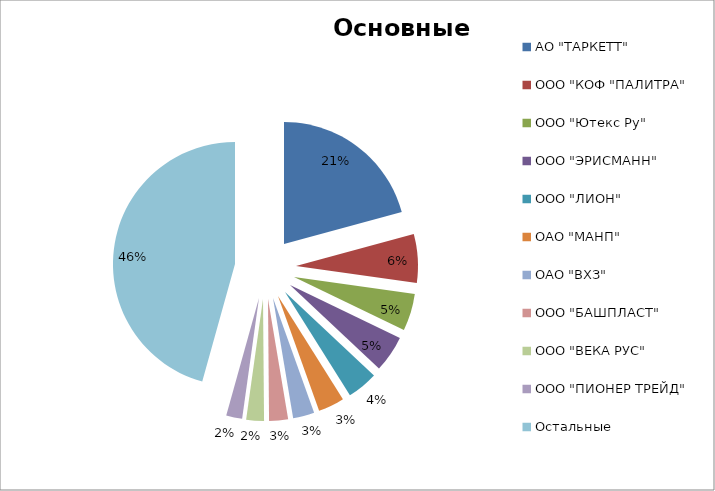
| Category | Стоимость, USD |
|---|---|
| АО "ТАРКЕТТ" | 3920529.81 |
| ООО "КОФ "ПАЛИТРА" | 1215515.77 |
| ООО "Ютекс Ру" | 928500.52 |
| ООО "ЭРИСМАНН" | 913262.6 |
| ООО "ЛИОН" | 768313.2 |
| ОАО "МАНП" | 653499 |
| ОАО "ВХЗ" | 533254.19 |
| ООО "БАШПЛАСТ" | 472720 |
| ООО "ВЕКА РУС" | 442805.01 |
| ООО "ПИОНЕР ТРЕЙД" | 399330 |
| Остальные | 8615550.08 |